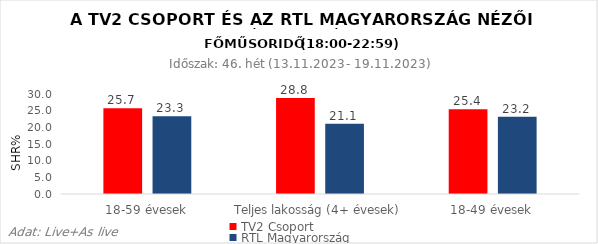
| Category | TV2 Csoport | RTL Magyarország |
|---|---|---|
| 18-59 évesek | 25.7 | 23.3 |
| Teljes lakosság (4+ évesek) | 28.8 | 21.1 |
| 18-49 évesek | 25.4 | 23.2 |